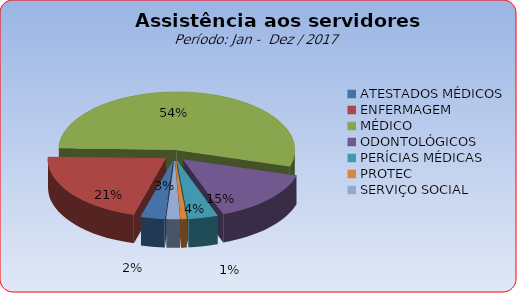
| Category | Series 0 |
|---|---|
| ATESTADOS MÉDICOS | 3.267 |
| ENFERMAGEM | 21.03 |
| MÉDICO | 54.147 |
| ODONTOLÓGICOS | 14.933 |
| PERÍCIAS MÉDICAS | 4.019 |
| PROTEC | 0.783 |
| SERVIÇO SOCIAL | 1.821 |